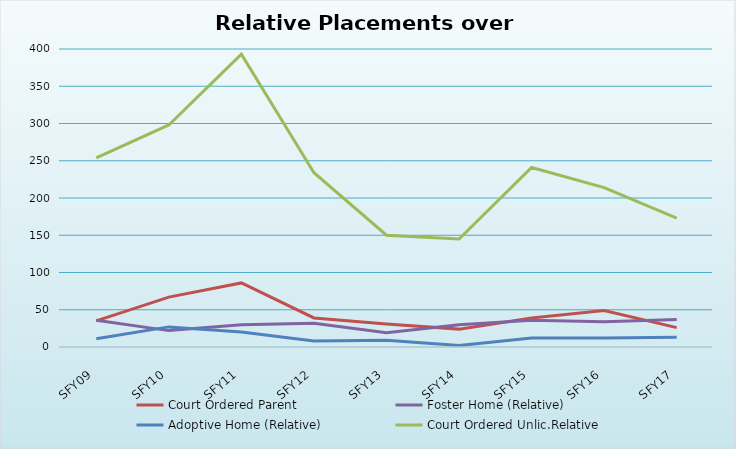
| Category | Court Ordered Parent | Foster Home (Relative) | Adoptive Home (Relative) | Court Ordered Unlic.Relative |
|---|---|---|---|---|
| SFY09 | 35 | 36 | 11 | 254 |
| SFY10 | 67 | 22 | 27 | 298 |
| SFY11 | 86 | 30 | 20 | 393 |
| SFY12 | 39 | 32 | 8 | 234 |
| SFY13 | 31 | 19 | 9 | 150 |
| SFY14 | 24 | 30 | 2 | 145 |
| SFY15 | 39 | 36 | 12 | 241 |
| SFY16 | 49 | 34 | 12 | 214 |
| SFY17 | 26 | 37 | 13 | 173 |